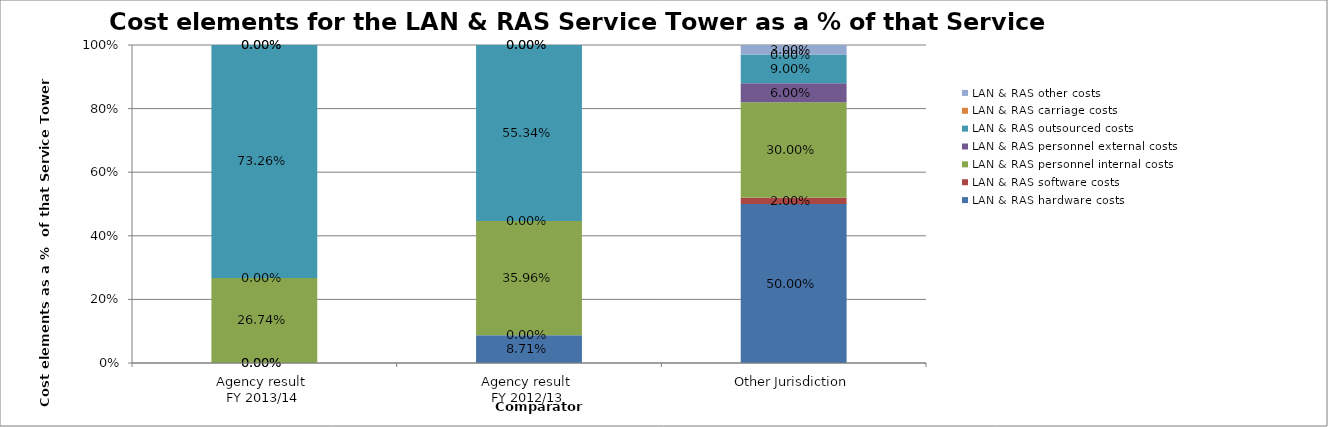
| Category | LAN & RAS hardware costs | LAN & RAS software costs | LAN & RAS personnel internal costs | LAN & RAS personnel external costs | LAN & RAS outsourced costs | LAN & RAS carriage costs | LAN & RAS other costs |
|---|---|---|---|---|---|---|---|
| Agency result 
FY 2013/14 | 0 | 0 | 0.267 | 0 | 0.733 | 0 | 0 |
| Agency result 
FY 2012/13 | 0.087 | 0 | 0.36 | 0 | 0.553 | 0 | 0 |
| Other Jurisdiction | 0.5 | 0.02 | 0.3 | 0.06 | 0.09 | 0 | 0.03 |